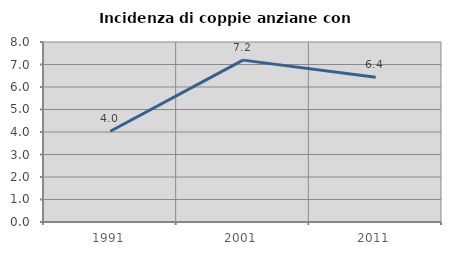
| Category | Incidenza di coppie anziane con figli |
|---|---|
| 1991.0 | 4.032 |
| 2001.0 | 7.194 |
| 2011.0 | 6.429 |